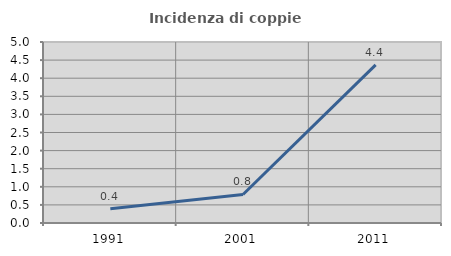
| Category | Incidenza di coppie miste |
|---|---|
| 1991.0 | 0.395 |
| 2001.0 | 0.787 |
| 2011.0 | 4.367 |